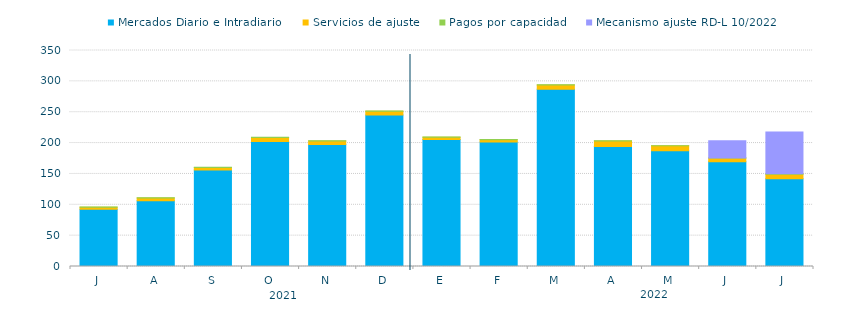
| Category | Mercados Diario e Intradiario  | Servicios de ajuste | Pagos por capacidad | Mecanismo ajuste RD-L 10/2022 |
|---|---|---|---|---|
| J | 92.77 | 3.09 | 0.55 | 0 |
| A | 106.41 | 4.62 | 0.31 | 0 |
| S | 156.53 | 3.92 | 0.31 | 0 |
| O | 202.39 | 6.69 | 0.26 | 0 |
| N | 197.49 | 5.94 | 0.38 | 0 |
| D | 245.63 | 5.94 | 0.55 | 0 |
| E | 205.75 | 3.78 | 0.43 | 0 |
| F | 201.85 | 3.39 | 0.46 | 0 |
| M | 287.06 | 6.92 | 0.33 | 0 |
| A | 194.26 | 9.06 | 0.24 | 0 |
| M | 187.74 | 7.84 | 0.23 | 0 |
| J | 169.75 | 6 | 0.25 | 27.64 |
| J | 142.38 | 7.284 | 0.43 | 67.984 |